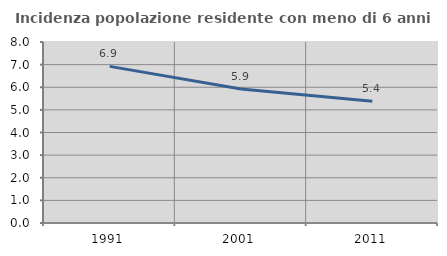
| Category | Incidenza popolazione residente con meno di 6 anni |
|---|---|
| 1991.0 | 6.924 |
| 2001.0 | 5.919 |
| 2011.0 | 5.379 |